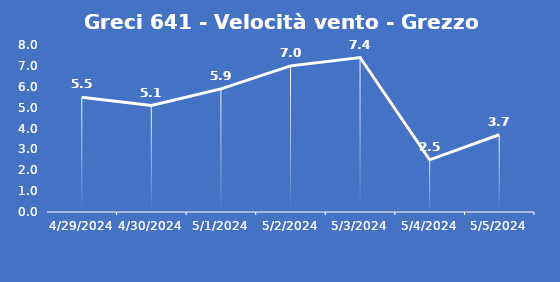
| Category | Greci 641 - Velocità vento - Grezzo (m/s) |
|---|---|
| 4/29/24 | 5.5 |
| 4/30/24 | 5.1 |
| 5/1/24 | 5.9 |
| 5/2/24 | 7 |
| 5/3/24 | 7.4 |
| 5/4/24 | 2.5 |
| 5/5/24 | 3.7 |